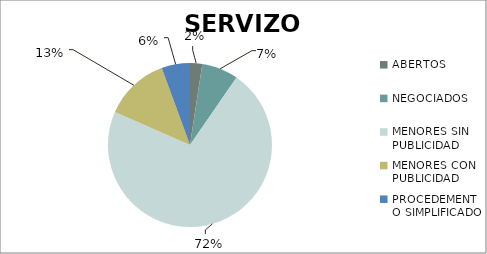
| Category | Series 0 |
|---|---|
| ABERTOS  | 3 |
| NEGOCIADOS  | 9 |
| MENORES SIN PUBLICIDAD | 90 |
| MENORES CON PUBLICIDAD | 16 |
| PROCEDEMENTO SIMPLIFICADO | 7 |